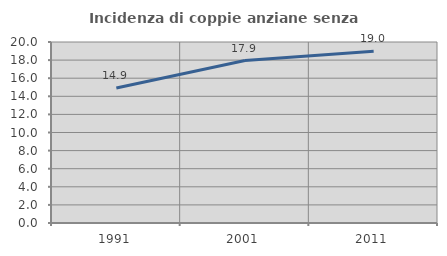
| Category | Incidenza di coppie anziane senza figli  |
|---|---|
| 1991.0 | 14.912 |
| 2001.0 | 17.949 |
| 2011.0 | 18.966 |